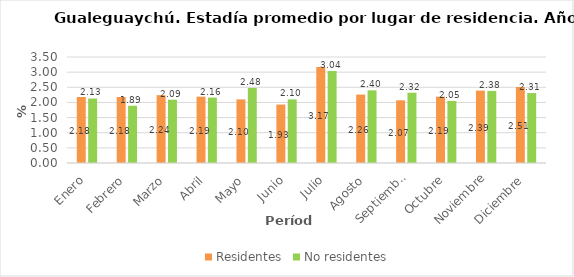
| Category | Residentes | No residentes |
|---|---|---|
| Enero | 2.18 | 2.13 |
| Febrero | 2.18 | 1.89 |
| Marzo | 2.24 | 2.09 |
| Abril | 2.19 | 2.16 |
| Mayo | 2.1 | 2.48 |
| Junio | 1.93 | 2.1 |
| Julio | 3.17 | 3.04 |
| Agosto | 2.26 | 2.4 |
| Septiembre | 2.07 | 2.32 |
| Octubre | 2.19 | 2.05 |
| Noviembre | 2.39 | 2.38 |
| Diciembre | 2.51 | 2.31 |